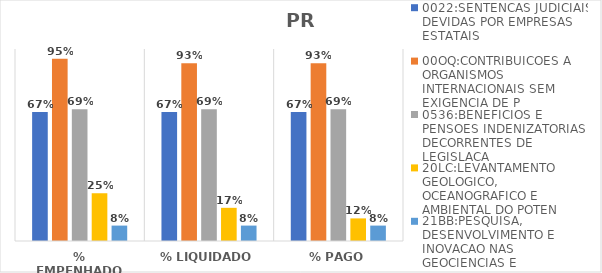
| Category | 0022:SENTENCAS JUDICIAIS DEVIDAS POR EMPRESAS ESTATAIS | 00OQ:CONTRIBUICOES A ORGANISMOS INTERNACIONAIS SEM EXIGENCIA DE P | 0536:BENEFICIOS E PENSOES INDENIZATORIAS DECORRENTES DE LEGISLACA | 20LC:LEVANTAMENTO GEOLOGICO, OCEANOGRAFICO E AMBIENTAL DO POTEN | 21BB:PESQUISA, DESENVOLVIMENTO E INOVACAO NAS GEOCIENCIAS E |
|---|---|---|---|---|---|
| % EMPENHADO | 0.671 | 0.95 | 0.687 | 0.249 | 0.08 |
| % LIQUIDADO | 0.671 | 0.926 | 0.687 | 0.173 | 0.08 |
| % PAGO | 0.671 | 0.926 | 0.687 | 0.118 | 0.08 |